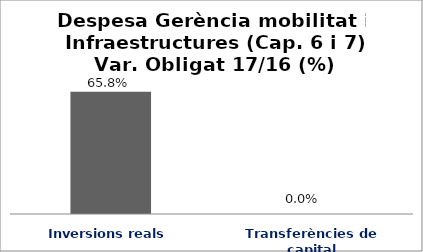
| Category | Series 0 |
|---|---|
| Inversions reals | 0.658 |
| Transferències de capital | 0 |